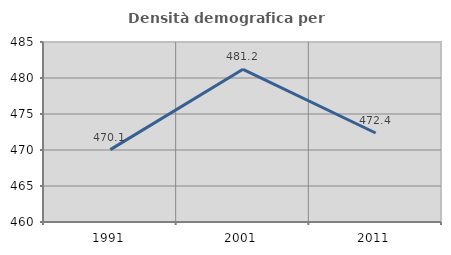
| Category | Densità demografica |
|---|---|
| 1991.0 | 470.054 |
| 2001.0 | 481.209 |
| 2011.0 | 472.362 |